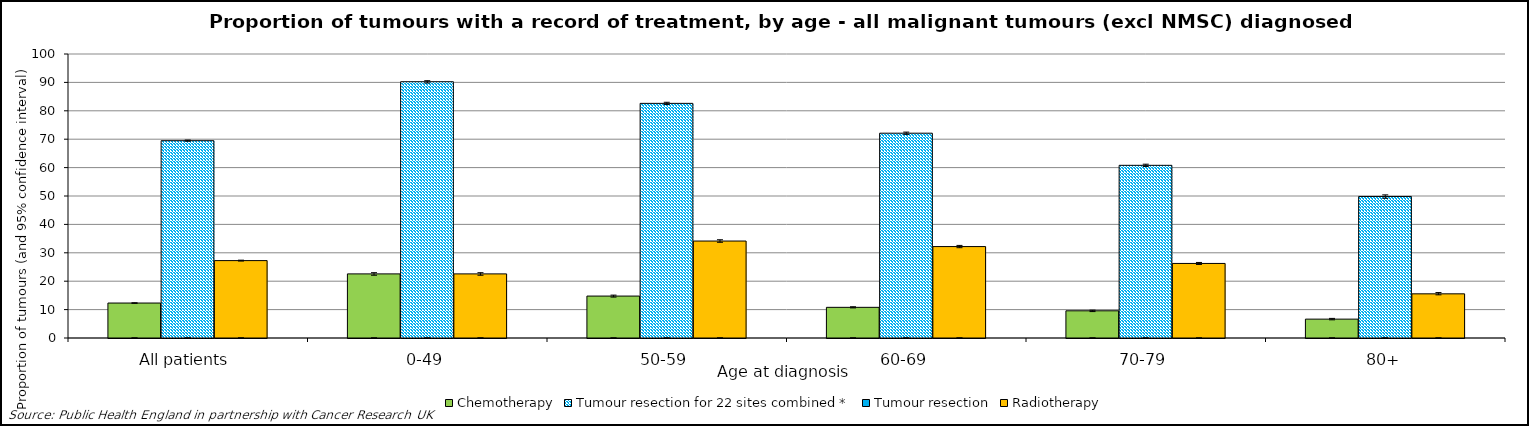
| Category | Chemotherapy | Tumour resection for 22 sites combined * | Radiotherapy all malig |
|---|---|---|---|
| All patients | 12.311 | 69.47 | 27.25 |
| 0-49 | 22.578 | 90.237 | 22.575 |
| 50-59 | 14.762 | 82.619 | 34.143 |
| 60-69 | 10.795 | 72.114 | 32.195 |
| 70-79 | 9.573 | 60.805 | 26.25 |
| 80+ | 6.645 | 49.836 | 15.553 |